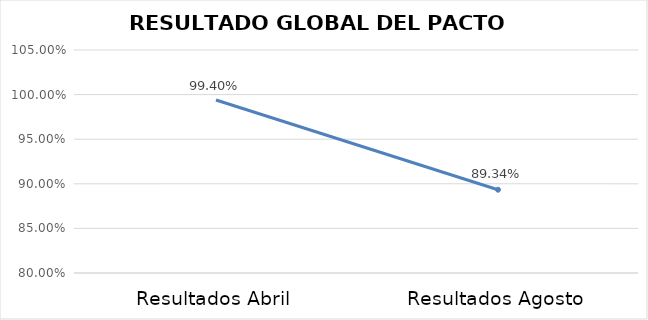
| Category | RESULTADO GLOBAL DEL PACTO |
|---|---|
| Resultados Abril | 0.994 |
| Resultados Agosto | 0.893 |